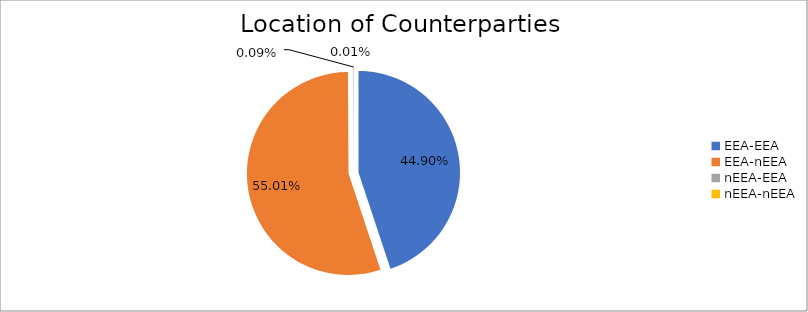
| Category | Series 0 |
|---|---|
| EEA-EEA | 4868998.964 |
| EEA-nEEA | 5964895.927 |
| nEEA-EEA | 9343.534 |
| nEEA-nEEA | 638.505 |